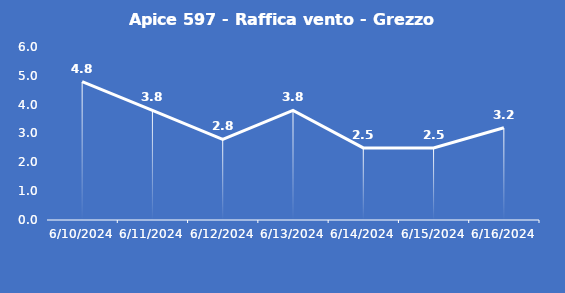
| Category | Apice 597 - Raffica vento - Grezzo (m/s) |
|---|---|
| 6/10/24 | 4.8 |
| 6/11/24 | 3.8 |
| 6/12/24 | 2.8 |
| 6/13/24 | 3.8 |
| 6/14/24 | 2.5 |
| 6/15/24 | 2.5 |
| 6/16/24 | 3.2 |